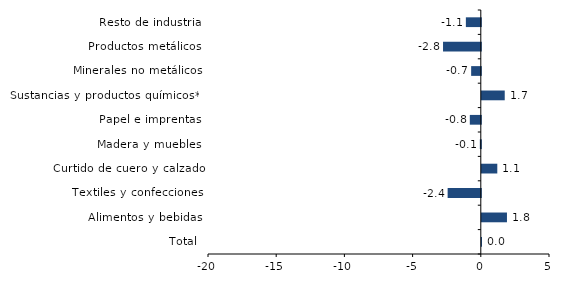
| Category | Series 0 |
|---|---|
| Total | 0.014 |
| Alimentos y bebidas | 1.845 |
| Textiles y confecciones | -2.432 |
| Curtido de cuero y calzado | 1.136 |
| Madera y muebles | -0.07 |
| Papel e imprentas | -0.806 |
| Sustancias y productos químicos** | 1.681 |
| Minerales no metálicos | -0.708 |
| Productos metálicos | -2.769 |
| Resto de industria | -1.095 |